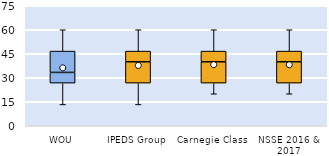
| Category | 25th | 50th | 75th |
|---|---|---|---|
| WOU | 26.667 | 6.667 | 13.333 |
| IPEDS Group | 26.667 | 13.333 | 6.667 |
| Carnegie Class | 26.667 | 13.333 | 6.667 |
| NSSE 2016 & 2017 | 26.667 | 13.333 | 6.667 |